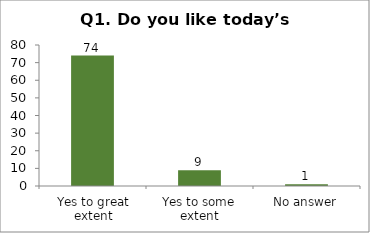
| Category | Q1. Do you like today’s session? |
|---|---|
| Yes to great extent | 74 |
| Yes to some extent | 9 |
| No answer | 1 |